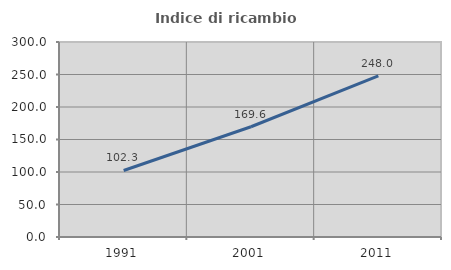
| Category | Indice di ricambio occupazionale  |
|---|---|
| 1991.0 | 102.326 |
| 2001.0 | 169.591 |
| 2011.0 | 248.031 |